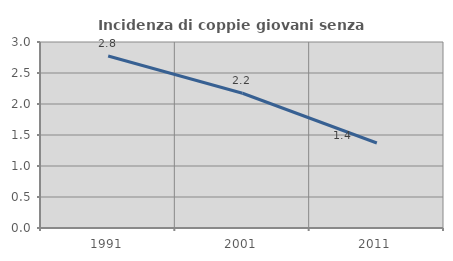
| Category | Incidenza di coppie giovani senza figli |
|---|---|
| 1991.0 | 2.775 |
| 2001.0 | 2.173 |
| 2011.0 | 1.371 |